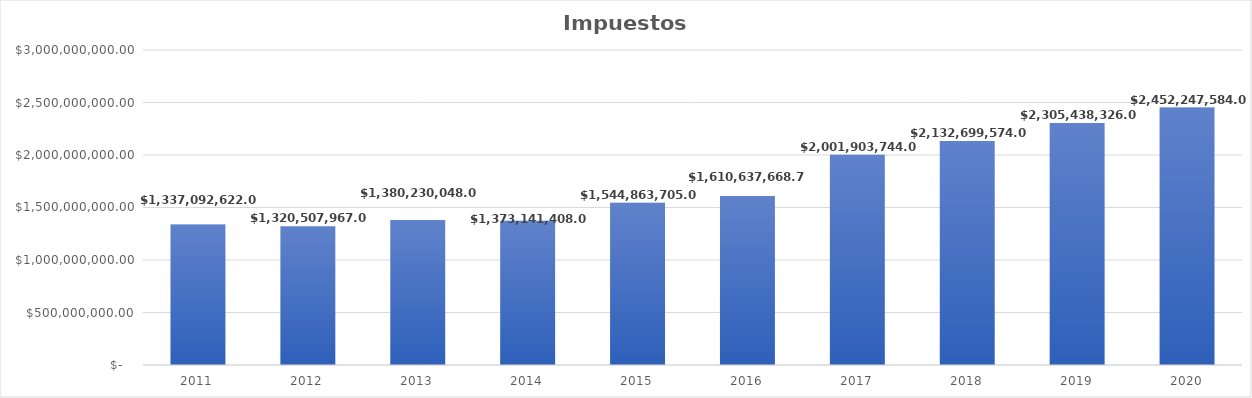
| Category | Impuestos (total) |
|---|---|
| 2011.0 | 1337092622 |
| 2012.0 | 1320507967 |
| 2013.0 | 1380230048 |
| 2014.0 | 1373141408 |
| 2015.0 | 1544863705 |
| 2016.0 | 1610637668.72 |
| 2017.0 | 2001903744 |
| 2018.0 | 2132699574 |
| 2019.0 | 2305438326 |
| 2020.0 | 2452247584 |